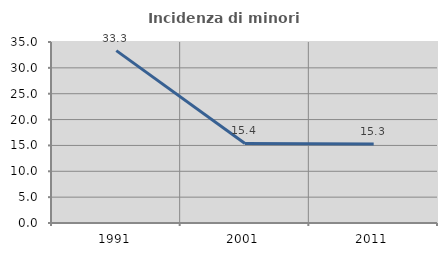
| Category | Incidenza di minori stranieri |
|---|---|
| 1991.0 | 33.333 |
| 2001.0 | 15.385 |
| 2011.0 | 15.278 |